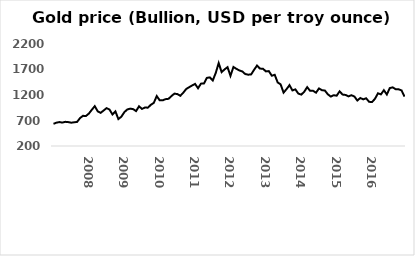
| Category | Series 0 |
|---|---|
| nan | 634.5 |
| nan | 657.55 |
| nan | 669.07 |
| nan | 658.8 |
| nan | 673.85 |
| nan | 668.35 |
| nan | 656.85 |
| nan | 664.75 |
| nan | 672.2 |
| nan | 747.3 |
| nan | 791.5 |
| nan | 787.55 |
| 2008.0 | 836.15 |
| nan | 910.45 |
| nan | 981.35 |
| nan | 879.55 |
| nan | 850.15 |
| nan | 896.7 |
| nan | 942.9 |
| nan | 914.4 |
| nan | 817.95 |
| nan | 878.1 |
| nan | 727.75 |
| nan | 773.65 |
| 2009.0 | 862.2 |
| nan | 915.55 |
| nan | 932.7 |
| nan | 923.2 |
| nan | 884.4 |
| nan | 978.7 |
| nan | 926.75 |
| nan | 954.9 |
| nan | 951.15 |
| nan | 1007.7 |
| nan | 1044.9 |
| nan | 1179.5 |
| 2010.0 | 1096 |
| nan | 1094.7 |
| nan | 1118.7 |
| nan | 1125.25 |
| nan | 1179.85 |
| nan | 1226.7 |
| nan | 1217.8 |
| nan | 1184.65 |
| nan | 1244.35 |
| nan | 1318.63 |
| nan | 1352.8 |
| nan | 1387.15 |
| 2011.0 | 1417.63 |
| nan | 1332.2 |
| nan | 1422.8 |
| nan | 1424.82 |
| nan | 1535.8 |
| nan | 1545.3 |
| nan | 1485.05 |
| nan | 1631.09 |
| nan | 1826.35 |
| nan | 1648.95 |
| nan | 1701.8 |
| nan | 1745.15 |
| 2012.0 | 1574.57 |
| nan | 1749.24 |
| nan | 1713.15 |
| nan | 1682.34 |
| nan | 1662.4 |
| nan | 1611.34 |
| nan | 1598.2 |
| nan | 1603.59 |
| nan | 1693.98 |
| nan | 1777.3 |
| nan | 1717.4 |
| nan | 1716.22 |
| 2013.0 | 1662.41 |
| nan | 1668.8 |
| nan | 1578.51 |
| nan | 1595.8 |
| nan | 1445.78 |
| nan | 1408.95 |
| nan | 1246.84 |
| nan | 1314.44 |
| nan | 1393.3 |
| nan | 1290.24 |
| nan | 1309.9 |
| nan | 1227.74 |
| 2014.0 | 1207.85 |
| nan | 1263.9 |
| nan | 1353.99 |
| nan | 1281.15 |
| nan | 1282.28 |
| nan | 1245.43 |
| nan | 1329.03 |
| nan | 1294.69 |
| nan | 1287.29 |
| nan | 1213.9 |
| nan | 1169.23 |
| nan | 1195.64 |
| 2015.0 | 1186.33 |
| nan | 1271.58 |
| nan | 1208.76 |
| nan | 1201.07 |
| nan | 1173.09 |
| nan | 1195.74 |
| nan | 1170.4 |
| nan | 1092.19 |
| nan | 1140.67 |
| nan | 1115.17 |
| nan | 1135.34 |
| nan | 1065.99 |
| 2016.0 | 1062.38 |
| nan | 1126.75 |
| nan | 1233.38 |
| nan | 1212.38 |
| nan | 1294.34 |
| nan | 1210.07 |
| nan | 1335.97 |
| nan | 1349.98 |
| nan | 1312.72 |
| nan | 1311.74 |
| nan | 1288.8 |
| nan | 1167.89 |